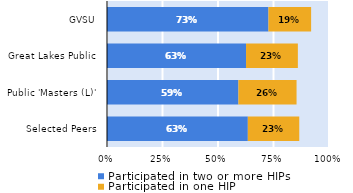
| Category | Participated in two or more HIPs | Participated in one HIP |
|---|---|---|
| Selected Peers | 0.634 | 0.232 |
| Public 'Masters (L)' | 0.592 | 0.262 |
| Great Lakes Public | 0.626 | 0.233 |
| GVSU | 0.727 | 0.192 |